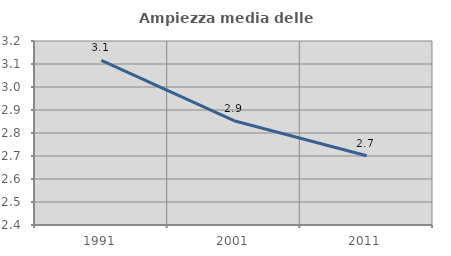
| Category | Ampiezza media delle famiglie |
|---|---|
| 1991.0 | 3.116 |
| 2001.0 | 2.853 |
| 2011.0 | 2.701 |